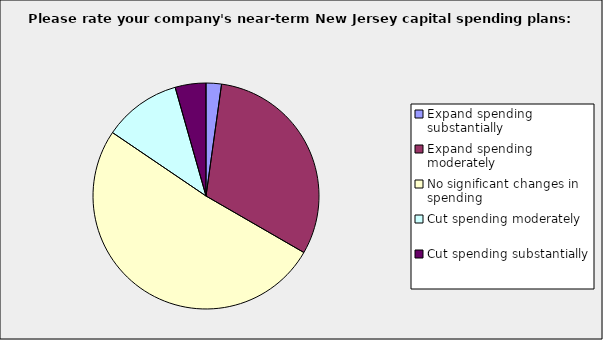
| Category | Series 0 |
|---|---|
| Expand spending substantially | 0.022 |
| Expand spending moderately | 0.311 |
| No significant changes in spending | 0.511 |
| Cut spending moderately | 0.111 |
| Cut spending substantially | 0.044 |